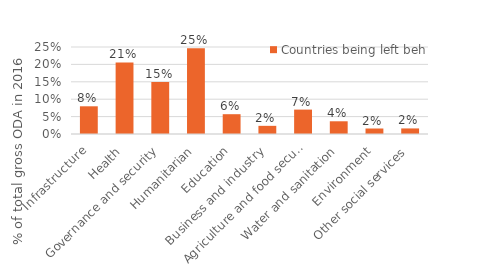
| Category | Countries being left behind |
|---|---|
| Infrastructure | 0.08 |
| Health | 0.206 |
| Governance and security | 0.149 |
| Humanitarian | 0.246 |
| Education | 0.057 |
| Business and industry | 0.023 |
| Agriculture and food security | 0.07 |
| Water and sanitation | 0.037 |
| Environment | 0.016 |
| Other social services | 0.016 |